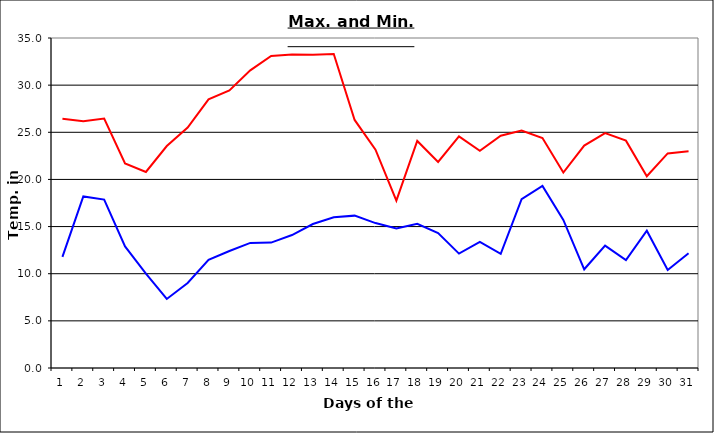
| Category | Series 0 | Series 1 |
|---|---|---|
| 0 | 26.43 | 11.78 |
| 1 | 26.18 | 18.2 |
| 2 | 26.45 | 17.86 |
| 3 | 21.7 | 12.89 |
| 4 | 20.79 | 10.02 |
| 5 | 23.54 | 7.32 |
| 6 | 25.51 | 9.02 |
| 7 | 28.49 | 11.47 |
| 8 | 29.43 | 12.41 |
| 9 | 31.57 | 13.27 |
| 10 | 33.09 | 13.3 |
| 11 | 33.25 | 14.1 |
| 12 | 33.23 | 15.27 |
| 13 | 33.3 | 15.98 |
| 14 | 26.31 | 16.16 |
| 15 | 23.16 | 15.37 |
| 16 | 17.75 | 14.8 |
| 17 | 24.08 | 15.3 |
| 18 | 21.85 | 14.32 |
| 19 | 24.56 | 12.13 |
| 20 | 23.04 | 13.38 |
| 21 | 24.64 | 12.1 |
| 22 | 25.18 | 17.9 |
| 23 | 24.39 | 19.31 |
| 24 | 20.73 | 15.7 |
| 25 | 23.59 | 10.47 |
| 26 | 24.91 | 12.98 |
| 27 | 24.11 | 11.45 |
| 28 | 20.34 | 14.56 |
| 29 | 22.76 | 10.4 |
| 30 | 22.99 | 12.17 |